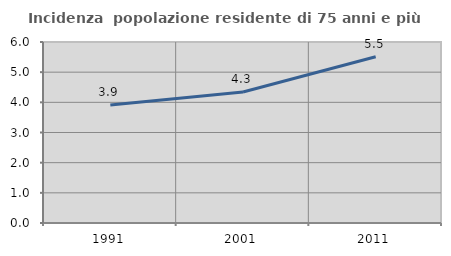
| Category | Incidenza  popolazione residente di 75 anni e più |
|---|---|
| 1991.0 | 3.91 |
| 2001.0 | 4.342 |
| 2011.0 | 5.51 |